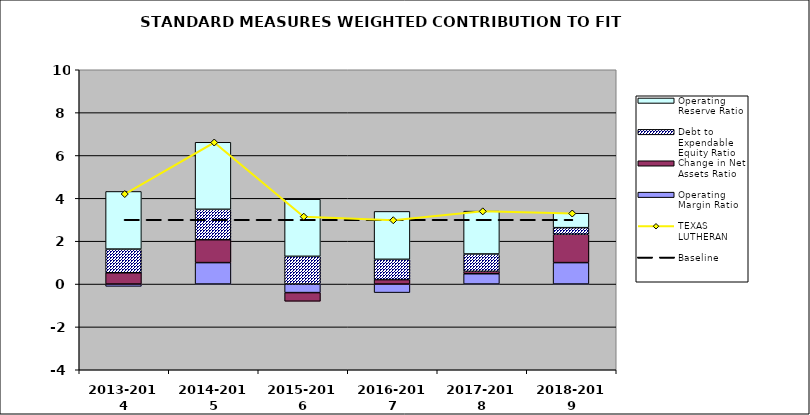
| Category | Operating Margin Ratio | Change in Net Assets Ratio | Debt to Expendable Equity Ratio | Operating Reserve Ratio |
|---|---|---|---|---|
| 2013-2014 | -0.109 | 0.526 | 1.105 | 2.69 |
| 2014-2015 | 1 | 1.069 | 1.418 | 3.128 |
| 2015-2016 | -0.4 | -0.404 | 1.292 | 2.666 |
| 2016-2017 | -0.4 | 0.205 | 0.948 | 2.235 |
| 2017-2018 | 0.481 | 0.112 | 0.81 | 2 |
| 2018-2019 | 1 | 1.324 | 0.307 | 0.672 |